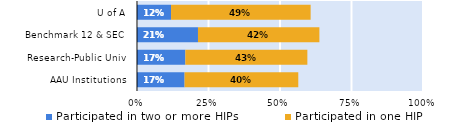
| Category | Participated in two or more HIPs | Participated in one HIP |
|---|---|---|
| AAU Institutions | 0.166 | 0.398 |
| Research-Public Univ | 0.169 | 0.427 |
| Benchmark 12 & SEC | 0.213 | 0.425 |
| U of A | 0.119 | 0.488 |